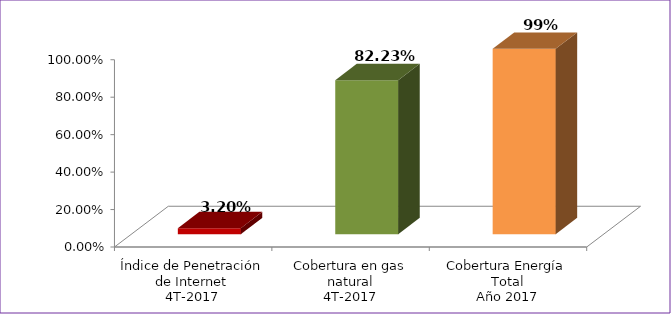
| Category | Series 0 |
|---|---|
| Índice de Penetración de Internet
4T-2017 | 0.032 |
| Cobertura en gas natural
4T-2017 | 0.822 |
| Cobertura Energía Total
Año 2017 | 0.99 |